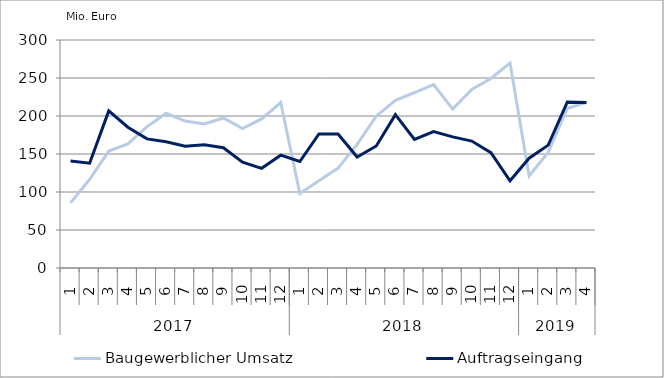
| Category | Baugewerblicher Umsatz | Auftragseingang |
|---|---|---|
| 0 | 85701.947 | 140751.008 |
| 1 | 116743.276 | 137863.383 |
| 2 | 153810.055 | 206710.579 |
| 3 | 163342.989 | 185183.797 |
| 4 | 185946.221 | 169878.51 |
| 5 | 203627.91 | 166148.392 |
| 6 | 193377.256 | 160134.206 |
| 7 | 189429.952 | 162221.206 |
| 8 | 197405.279 | 158305.285 |
| 9 | 183450.026 | 139156.761 |
| 10 | 196209.214 | 131165.419 |
| 11 | 217688.447 | 148434.901 |
| 12 | 97959.056 | 140119.385 |
| 13 | 114756.787 | 176330.213 |
| 14 | 131454.642 | 176241.061 |
| 15 | 162648.053 | 146063.407 |
| 16 | 199809.407 | 160551.931 |
| 17 | 220535.974 | 201835.846 |
| 18 | 230672.472 | 169132.23 |
| 19 | 241233.619 | 179396.293 |
| 20 | 209099.292 | 172542.764 |
| 21 | 234953.007 | 166991.729 |
| 22 | 249410.043 | 151835.629 |
| 23 | 269773.227 | 114807.456 |
| 24 | 120975.133 | 144510.881 |
| 25 | 152329.786 | 161685.201 |
| 26 | 210227.67 | 218455.879 |
| 27 | 217522.321 | 217610.064 |